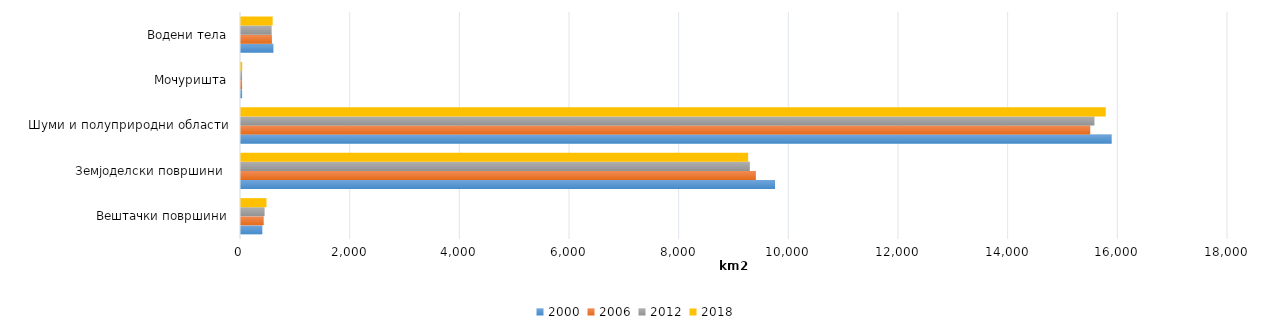
| Category | 2000 | 2006 | 2012 | 2018 |
|---|---|---|---|---|
| Вештачки површини | 389 | 414 | 430 | 464.213 |
| Земјоделски површини  | 9739 | 9390 | 9279.76 | 9248.273 |
| Шуми и полуприродни области | 15879 | 15488 | 15564.489 | 15769.882 |
| Мочуришта | 20 | 20 | 19.5 | 22.466 |
| Водени тела | 591 | 564 | 558.56 | 577.361 |